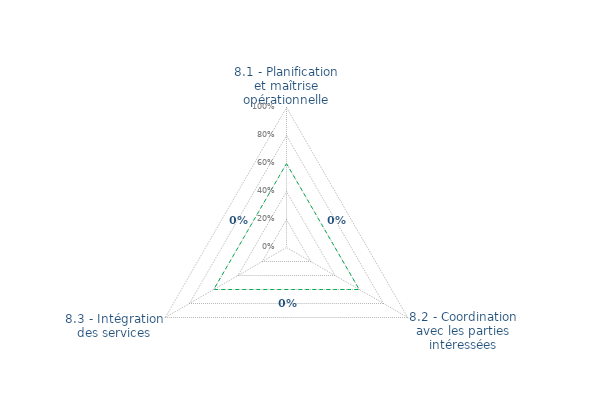
| Category | Art. 8 | limite de CONFORMITÉ |
|---|---|---|
| 8.1 - Planification et maîtrise opérationnelle | 0 | 0.6 |
| 8.2 - Coordination avec les parties intéressées | 0 | 0.6 |
| 8.3 - Intégration des services | 0 | 0.6 |